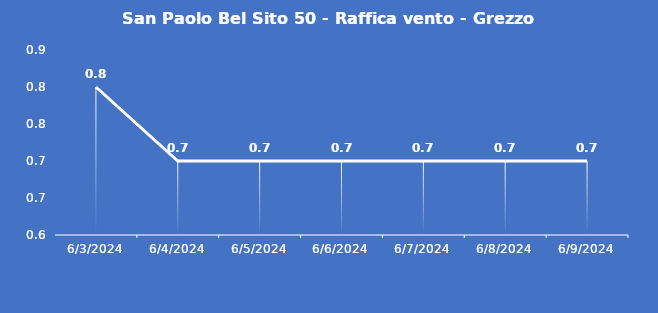
| Category | San Paolo Bel Sito 50 - Raffica vento - Grezzo (m/s) |
|---|---|
| 6/3/24 | 0.8 |
| 6/4/24 | 0.7 |
| 6/5/24 | 0.7 |
| 6/6/24 | 0.7 |
| 6/7/24 | 0.7 |
| 6/8/24 | 0.7 |
| 6/9/24 | 0.7 |